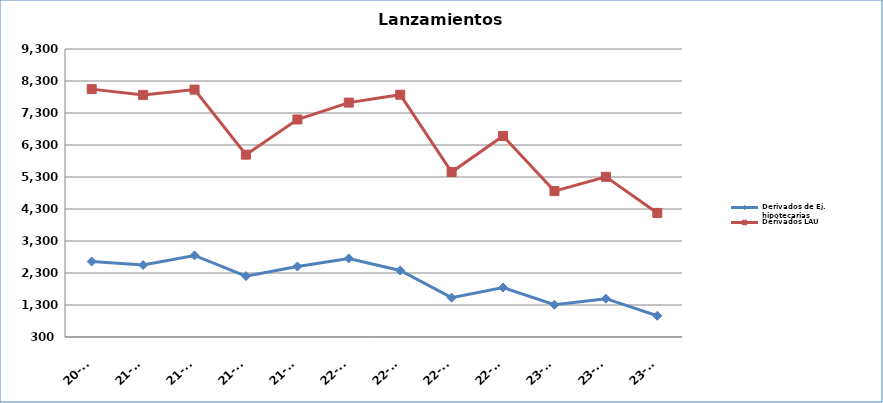
| Category | Derivados de Ej. hipotecarias | Derivados LAU |
|---|---|---|
| 20-T4 | 2659 | 8046 |
| 21-T1 | 2548 | 7866 |
| 21-T2 | 2849 | 8031 |
| 21-T3 | 2203 | 5999 |
| 21-T4 | 2503 | 7097 |
| 22-T1 | 2755 | 7625 |
| 22-T2 | 2377 | 7871 |
| 22-T3 | 1530 | 5455 |
| 22-T4 | 1847 | 6582 |
| 23-T1 | 1308 | 4860 |
| 23-T2 | 1497 | 5306 |
| 23-T3 | 963 | 4178 |